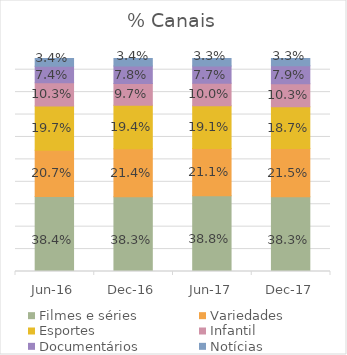
| Category | Filmes e séries | Variedades | Esportes | Infantil | Documentários | Notícias |
|---|---|---|---|---|---|---|
| 2016-06-01 | 0.384 | 0.207 | 0.197 | 0.103 | 0.074 | 0.034 |
| 2016-12-01 | 0.383 | 0.214 | 0.194 | 0.097 | 0.078 | 0.034 |
| 2017-06-01 | 0.388 | 0.211 | 0.191 | 0.1 | 0.077 | 0.033 |
| 2017-12-01 | 0.383 | 0.215 | 0.187 | 0.103 | 0.079 | 0.033 |